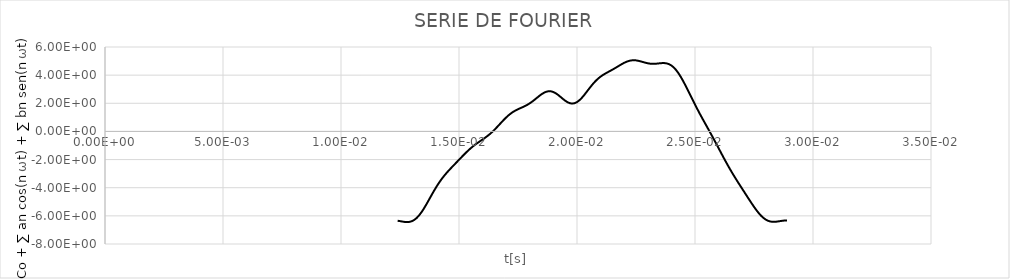
| Category | Co + ∑ an cos(nωt) + ∑ bn sen(nωt) |
|---|---|
| 0.0124 | -6.347 |
| 0.0125 | -6.375 |
| 0.0126 | -6.406 |
| 0.0127 | -6.432 |
| 0.0128 | -6.443 |
| 0.0129 | -6.429 |
| 0.013 | -6.381 |
| 0.0131 | -6.292 |
| 0.0132 | -6.16 |
| 0.0133 | -5.983 |
| 0.0134 | -5.766 |
| 0.0135 | -5.513 |
| 0.0136 | -5.234 |
| 0.0137 | -4.939 |
| 0.0138 | -4.637 |
| 0.0139 | -4.339 |
| 0.014 | -4.053 |
| 0.0141 | -3.784 |
| 0.0142 | -3.534 |
| 0.0143 | -3.305 |
| 0.0144 | -3.095 |
| 0.0145 | -2.9 |
| 0.0146 | -2.716 |
| 0.0147 | -2.538 |
| 0.0148 | -2.363 |
| 0.0149 | -2.189 |
| 0.015 | -2.015 |
| 0.0151 | -1.84 |
| 0.0152 | -1.668 |
| 0.0153 | -1.5 |
| 0.0154 | -1.34 |
| 0.0155 | -1.189 |
| 0.0156 | -1.05 |
| 0.0157 | -0.921 |
| 0.0158 | -0.8 |
| 0.0159 | -0.686 |
| 0.016 | -0.573 |
| 0.0161 | -0.457 |
| 0.0162 | -0.332 |
| 0.0163 | -0.197 |
| 0.0164 | -0.048 |
| 0.0165 | 0.114 |
| 0.0166 | 0.287 |
| 0.0167 | 0.467 |
| 0.0168 | 0.649 |
| 0.0169 | 0.827 |
| 0.017 | 0.994 |
| 0.0171 | 1.147 |
| 0.0172 | 1.281 |
| 0.0173 | 1.396 |
| 0.0174 | 1.494 |
| 0.0175 | 1.578 |
| 0.0176 | 1.654 |
| 0.0177 | 1.728 |
| 0.0178 | 1.807 |
| 0.0179 | 1.897 |
| 0.018 | 2 |
| 0.0181 | 2.118 |
| 0.0182 | 2.248 |
| 0.0183 | 2.385 |
| 0.0184 | 2.52 |
| 0.0185 | 2.645 |
| 0.0186 | 2.749 |
| 0.0187 | 2.822 |
| 0.0188 | 2.857 |
| 0.0189 | 2.85 |
| 0.019 | 2.801 |
| 0.0191 | 2.713 |
| 0.0192 | 2.594 |
| 0.0193 | 2.457 |
| 0.0194 | 2.315 |
| 0.0195 | 2.183 |
| 0.0196 | 2.075 |
| 0.0197 | 2.004 |
| 0.0198 | 1.98 |
| 0.0199 | 2.006 |
| 0.02 | 2.085 |
| 0.0201 | 2.212 |
| 0.0202 | 2.379 |
| 0.0203 | 2.575 |
| 0.0204 | 2.79 |
| 0.0205 | 3.01 |
| 0.0206 | 3.225 |
| 0.0207 | 3.425 |
| 0.0208 | 3.604 |
| 0.0209 | 3.761 |
| 0.021 | 3.895 |
| 0.0211 | 4.011 |
| 0.0212 | 4.112 |
| 0.0213 | 4.206 |
| 0.0214 | 4.296 |
| 0.0215 | 4.389 |
| 0.0216 | 4.485 |
| 0.0217 | 4.585 |
| 0.0218 | 4.687 |
| 0.0219 | 4.786 |
| 0.022 | 4.876 |
| 0.0221 | 4.953 |
| 0.0222 | 5.011 |
| 0.0223 | 5.047 |
| 0.0224 | 5.059 |
| 0.0225 | 5.049 |
| 0.0226 | 5.02 |
| 0.0227 | 4.978 |
| 0.0228 | 4.93 |
| 0.0229 | 4.882 |
| 0.023 | 4.843 |
| 0.0231 | 4.816 |
| 0.0232 | 4.805 |
| 0.0233 | 4.808 |
| 0.0234 | 4.822 |
| 0.0235 | 4.84 |
| 0.0236 | 4.855 |
| 0.0237 | 4.857 |
| 0.0238 | 4.834 |
| 0.0239 | 4.779 |
| 0.024 | 4.685 |
| 0.0241 | 4.547 |
| 0.0242 | 4.363 |
| 0.0243 | 4.136 |
| 0.0244 | 3.871 |
| 0.0245 | 3.574 |
| 0.0246 | 3.255 |
| 0.0247 | 2.921 |
| 0.0248 | 2.581 |
| 0.0249 | 2.242 |
| 0.025 | 1.909 |
| 0.0251 | 1.584 |
| 0.0252 | 1.268 |
| 0.0253 | 0.959 |
| 0.0254 | 0.656 |
| 0.0255 | 0.355 |
| 0.0256 | 0.053 |
| 0.0257 | -0.252 |
| 0.0258 | -0.562 |
| 0.0259 | -0.876 |
| 0.026 | -1.192 |
| 0.0261 | -1.51 |
| 0.0262 | -1.825 |
| 0.0263 | -2.134 |
| 0.0264 | -2.436 |
| 0.0265 | -2.729 |
| 0.0266 | -3.012 |
| 0.0267 | -3.286 |
| 0.0268 | -3.554 |
| 0.0269 | -3.817 |
| 0.027 | -4.077 |
| 0.0271 | -4.337 |
| 0.0272 | -4.596 |
| 0.0273 | -4.855 |
| 0.0274 | -5.11 |
| 0.0275 | -5.357 |
| 0.0276 | -5.59 |
| 0.0277 | -5.803 |
| 0.0278 | -5.99 |
| 0.0279 | -6.146 |
| 0.028 | -6.268 |
| 0.0281 | -6.353 |
| 0.0282 | -6.404 |
| 0.0283 | -6.425 |
| 0.0284 | -6.421 |
| 0.0285 | -6.402 |
| 0.0286 | -6.375 |
| 0.0287 | -6.349 |
| 0.0288 | -6.331 |
| 0.0289 | -6.325 |